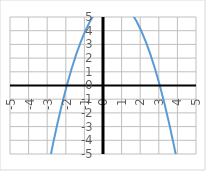
| Category | y |
|---|---|
| -5.0 | -24 |
| -4.75 | -21.312 |
| -4.5 | -18.75 |
| -4.25 | -16.312 |
| -4.0 | -14 |
| -3.75 | -11.812 |
| -3.5 | -9.75 |
| -3.25 | -7.812 |
| -3.0 | -6 |
| -2.75 | -4.312 |
| -2.5 | -2.75 |
| -2.25 | -1.312 |
| -2.0 | 0 |
| -1.75 | 1.188 |
| -1.5 | 2.25 |
| -1.25 | 3.188 |
| -1.0 | 4 |
| -0.75 | 4.688 |
| -0.5 | 5.25 |
| -0.25 | 5.688 |
| 0.0 | 6 |
| 0.25 | 6.188 |
| 0.5 | 6.25 |
| 0.75 | 6.188 |
| 1.0 | 6 |
| 1.25 | 5.688 |
| 1.5 | 5.25 |
| 1.75 | 4.688 |
| 2.0 | 4 |
| 2.25 | 3.188 |
| 2.5 | 2.25 |
| 2.75 | 1.188 |
| 3.0 | 0 |
| 3.25 | -1.312 |
| 3.5 | -2.75 |
| 3.75 | -4.312 |
| 4.0 | -6 |
| 4.25 | -7.812 |
| 4.5 | -9.75 |
| 4.75 | -11.812 |
| 5.0 | -14 |